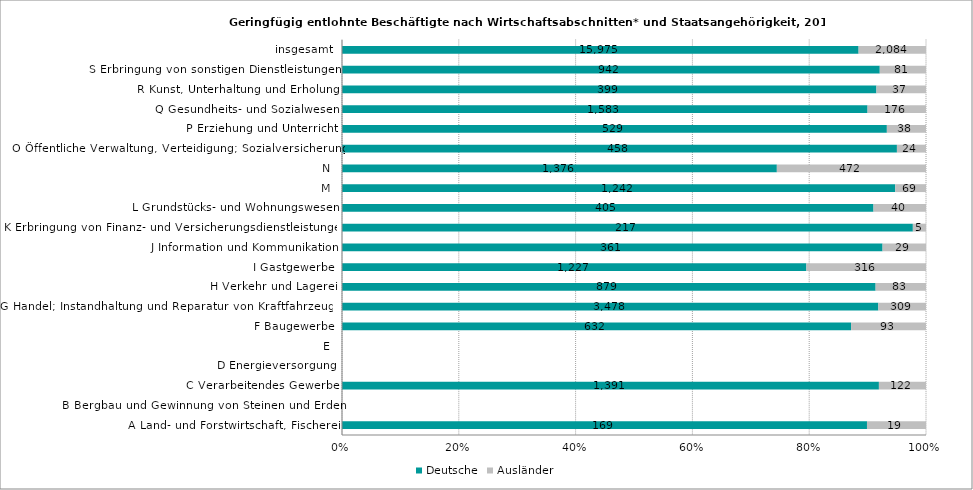
| Category | Deutsche | Ausländer |
|---|---|---|
| A Land- und Forstwirtschaft, Fischerei | 169 | 19 |
| B Bergbau und Gewinnung von Steinen und Erden | 0 | 0 |
| C Verarbeitendes Gewerbe | 1391 | 122 |
| D Energieversorgung | 0 | 0 |
| E | 0 | 0 |
| F Baugewerbe | 632 | 93 |
| G Handel; Instandhaltung und Reparatur von Kraftfahrzeugen | 3478 | 309 |
| H Verkehr und Lagerei | 879 | 83 |
| I Gastgewerbe | 1227 | 316 |
| J Information und Kommunikation | 361 | 29 |
| K Erbringung von Finanz- und Versicherungsdienstleistungen | 217 | 5 |
| L Grundstücks- und Wohnungswesen | 405 | 40 |
| M | 1242 | 69 |
| N | 1376 | 472 |
| O Öffentliche Verwaltung, Verteidigung; Sozialversicherung | 458 | 24 |
| P Erziehung und Unterricht | 529 | 38 |
| Q Gesundheits- und Sozialwesen | 1583 | 176 |
| R Kunst, Unterhaltung und Erholung | 399 | 37 |
| S Erbringung von sonstigen Dienstleistungen | 942 | 81 |
| insgesamt | 15975 | 2084 |